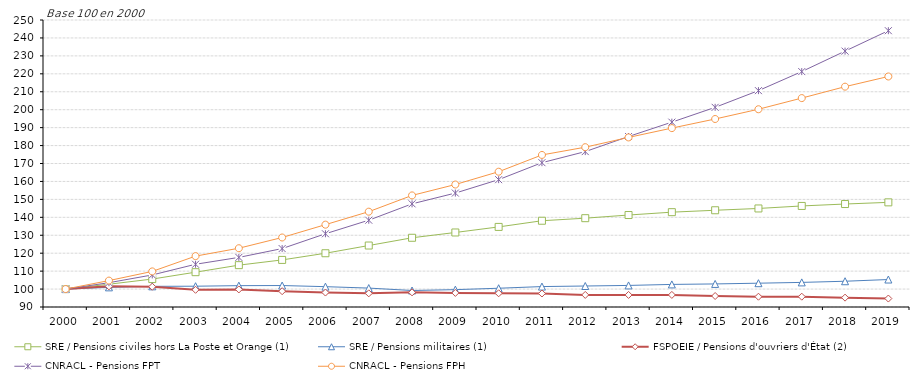
| Category | SRE / Pensions civiles hors La Poste et Orange (1) | SRE / Pensions militaires (1) | FSPOEIE / Pensions d'ouvriers d'État (2) | CNRACL - Pensions FPT | CNRACL - Pensions FPH |
|---|---|---|---|---|---|
| 2000.0 | 100 | 100 | 100 | 100 | 100 |
| 2001.0 | 102.693 | 100.955 | 101.508 | 103.552 | 104.725 |
| 2002.0 | 105.576 | 101.521 | 101.313 | 107.867 | 109.838 |
| 2003.0 | 109.411 | 101.591 | 99.574 | 113.825 | 118.365 |
| 2004.0 | 113.335 | 101.907 | 99.796 | 117.652 | 122.769 |
| 2005.0 | 116.249 | 101.96 | 98.813 | 122.576 | 128.751 |
| 2006.0 | 119.972 | 101.337 | 98.06 | 130.831 | 135.907 |
| 2007.0 | 124.273 | 100.543 | 97.611 | 138.38 | 143.143 |
| 2008.0 | 128.596 | 99.196 | 98.158 | 147.517 | 152.211 |
| 2009.0 | 131.542 | 99.673 | 97.846 | 153.518 | 158.277 |
| 2010.0 | 134.65 | 100.453 | 97.641 | 161 | 165.421 |
| 2011.0 | 138.088 | 101.392 | 97.525 | 170.457 | 174.769 |
| 2012.0 | 139.52 | 101.702 | 96.734 | 176.634 | 179.1 |
| 2013.0 | 141.279 | 102.024 | 96.729 | 185.048 | 184.538 |
| 2014.0 | 142.868 | 102.59 | 96.741 | 193.051 | 189.732 |
| 2015.0 | 143.932 | 102.865 | 96.129 | 201.31 | 194.812 |
| 2016.0 | 144.938 | 103.275 | 95.739 | 210.619 | 200.246 |
| 2017.0 | 146.334 | 103.714 | 95.757 | 221.24 | 206.465 |
| 2018.0 | 147.413 | 104.358 | 95.213 | 232.647 | 212.833 |
| 2019.0 | 148.343 | 105.319 | 94.713 | 244.039 | 218.51 |